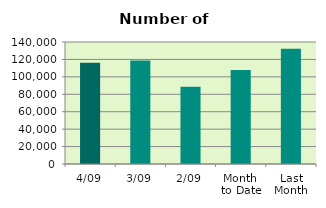
| Category | Series 0 |
|---|---|
| 4/09 | 116168 |
| 3/09 | 118722 |
| 2/09 | 88564 |
| Month 
to Date | 107818 |
| Last
Month | 132110.818 |